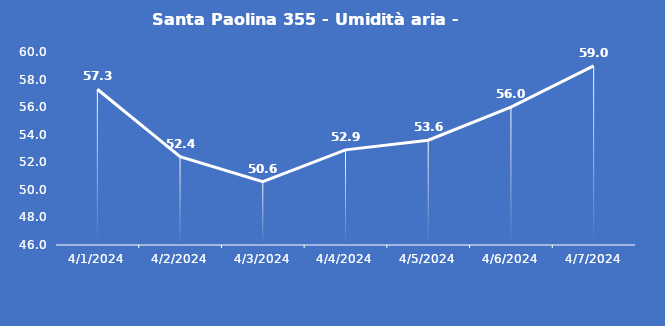
| Category | Santa Paolina 355 - Umidità aria - Grezzo (%) |
|---|---|
| 4/1/24 | 57.3 |
| 4/2/24 | 52.4 |
| 4/3/24 | 50.6 |
| 4/4/24 | 52.9 |
| 4/5/24 | 53.6 |
| 4/6/24 | 56 |
| 4/7/24 | 59 |